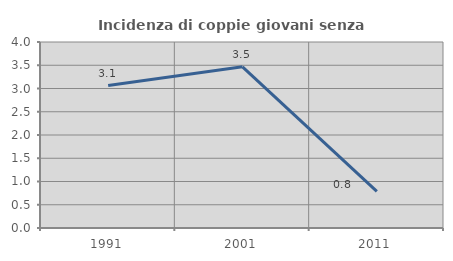
| Category | Incidenza di coppie giovani senza figli |
|---|---|
| 1991.0 | 3.063 |
| 2001.0 | 3.467 |
| 2011.0 | 0.786 |